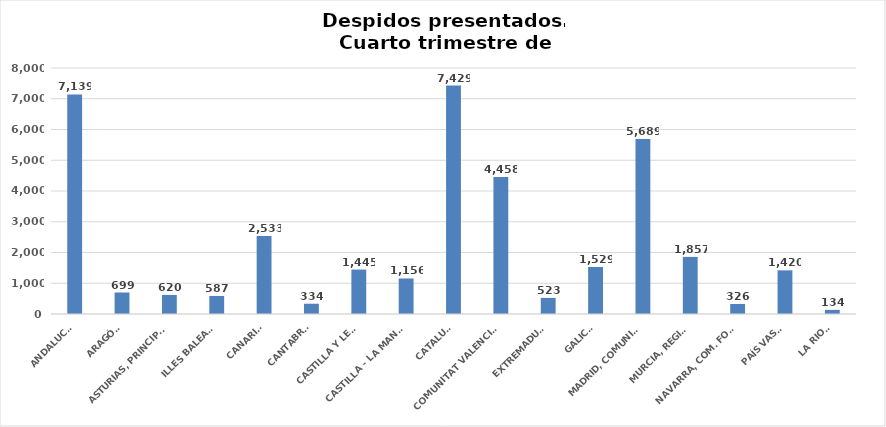
| Category | Series 0 |
|---|---|
| ANDALUCÍA | 7139 |
| ARAGÓN | 699 |
| ASTURIAS, PRINCIPADO | 620 |
| ILLES BALEARS | 587 |
| CANARIAS | 2533 |
| CANTABRIA | 334 |
| CASTILLA Y LEÓN | 1445 |
| CASTILLA - LA MANCHA | 1156 |
| CATALUÑA | 7429 |
| COMUNITAT VALENCIANA | 4458 |
| EXTREMADURA | 523 |
| GALICIA | 1529 |
| MADRID, COMUNIDAD | 5689 |
| MURCIA, REGIÓN | 1857 |
| NAVARRA, COM. FORAL | 326 |
| PAÍS VASCO | 1420 |
| LA RIOJA | 134 |